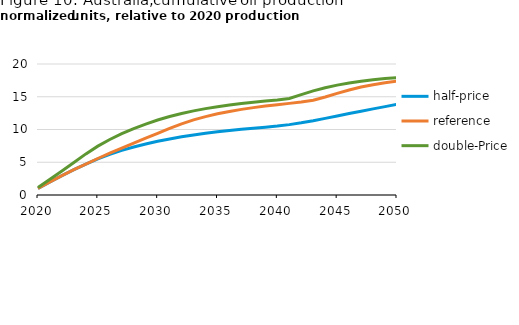
| Category | half-price | reference | double-Price |
|---|---|---|---|
| 2020 | 1 | 1 | 1.156 |
| 2021 | 2.009 | 2.009 | 2.398 |
| 2022 | 2.967 | 2.967 | 3.668 |
| 2023 | 3.868 | 3.868 | 4.958 |
| 2024 | 4.718 | 4.718 | 6.275 |
| 2025 | 5.517 | 5.575 | 7.46 |
| 2026 | 6.208 | 6.383 | 8.479 |
| 2027 | 6.81 | 7.16 | 9.364 |
| 2028 | 7.336 | 7.918 | 10.142 |
| 2029 | 7.797 | 8.67 | 10.834 |
| 2030 | 8.203 | 9.426 | 11.456 |
| 2031 | 8.562 | 10.164 | 11.99 |
| 2032 | 8.88 | 10.863 | 12.448 |
| 2033 | 9.162 | 11.462 | 12.843 |
| 2034 | 9.414 | 11.967 | 13.184 |
| 2035 | 9.64 | 12.396 | 13.482 |
| 2036 | 9.843 | 12.76 | 13.742 |
| 2037 | 10.025 | 13.072 | 13.97 |
| 2038 | 10.189 | 13.34 | 14.171 |
| 2039 | 10.338 | 13.572 | 14.348 |
| 2040 | 10.519 | 13.786 | 14.506 |
| 2041 | 10.744 | 13.989 | 14.738 |
| 2042 | 11.015 | 14.192 | 15.322 |
| 2043 | 11.333 | 14.47 | 15.906 |
| 2044 | 11.698 | 14.962 | 16.384 |
| 2045 | 12.071 | 15.518 | 16.777 |
| 2046 | 12.436 | 16.04 | 17.101 |
| 2047 | 12.795 | 16.479 | 17.368 |
| 2048 | 13.148 | 16.838 | 17.591 |
| 2049 | 13.496 | 17.133 | 17.776 |
| 2050 | 13.839 | 17.377 | 17.932 |